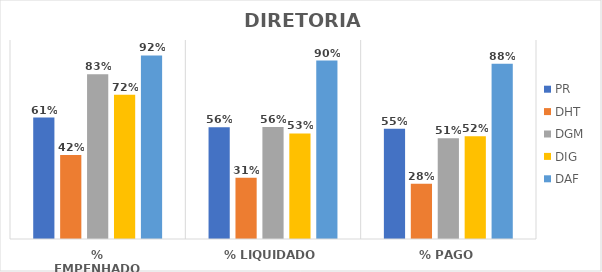
| Category | PR | DHT | DGM | DIG | DAF |
|---|---|---|---|---|---|
| % EMPENHADO | 0.61 | 0.422 | 0.828 | 0.724 | 0.922 |
| % LIQUIDADO | 0.562 | 0.307 | 0.563 | 0.531 | 0.897 |
| % PAGO | 0.554 | 0.278 | 0.507 | 0.517 | 0.88 |